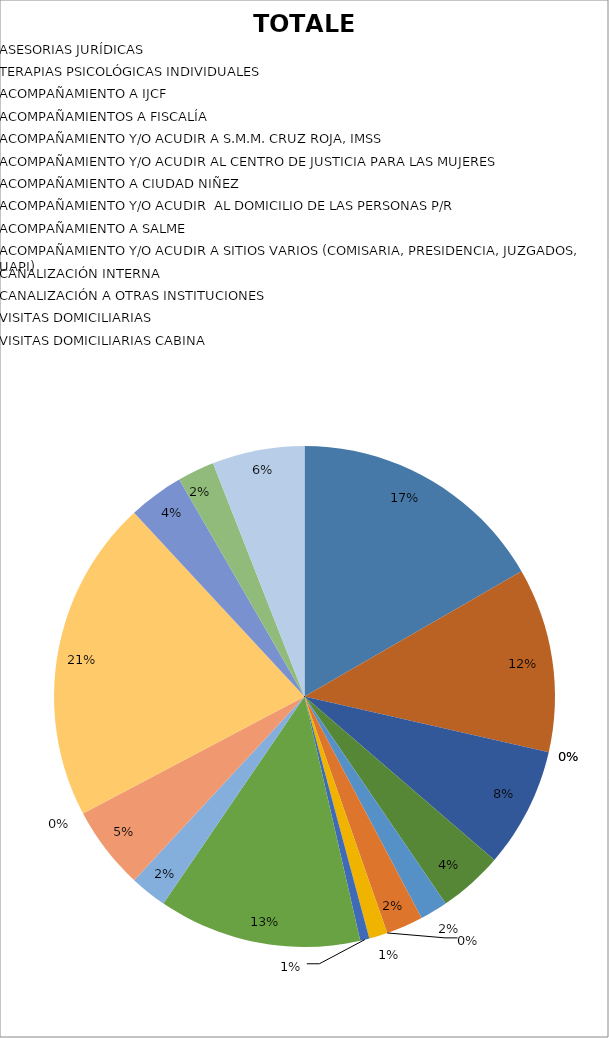
| Category | TOTALES |
|---|---|
| ASESORIAS JURÍDICAS | 28 |
| TERAPIAS PSICOLÓGICAS INDIVIDUALES | 20 |
| ACOMPAÑAMIENTO A IJCF | 0 |
| ACOMPAÑAMIENTOS A FISCALÍA | 0 |
| ACOMPAÑAMIENTO Y/O ACUDIR A S.M.M. CRUZ ROJA, IMSS | 13 |
| ACOMPAÑAMIENTO Y/O ACUDIR AL CENTRO DE JUSTICIA PARA LAS MUJERES | 7 |
| ACOMPAÑAMIENTO A CIUDAD NIÑEZ  | 3 |
| ACOMPAÑAMIENTO Y/O ACUDIR  AL DOMICILIO DE LAS PERSONAS P/R | 4 |
| ACOMPAÑAMIENTO A SALME | 0 |
| ACOMPAÑAMIENTO Y/O ACUDIR A SITIOS VARIOS (COMISARIA, PRESIDENCIA, JUZGADOS, UAPI)  | 2 |
| CANALIZACIÓN INTERNA | 1 |
| CANALIZACIÓN A OTRAS INSTITUCIONES | 22 |
| VISITAS DOMICILIARIAS | 4 |
| VISITAS DOMICILIARIAS CABINA | 9 |
| PLATICAS INFORMATIVAS ESCOLARES | 0 |
| PLATICAS INFORMATIVAS DELEGACIONES | 35 |
| ATENCIONES CANNAT | 6 |
| ENTREGAS CANNAT (ACTA CIRCUNSTANCIADA) | 4 |
| ATENCIONES CASOS EN CRISIS | 10 |